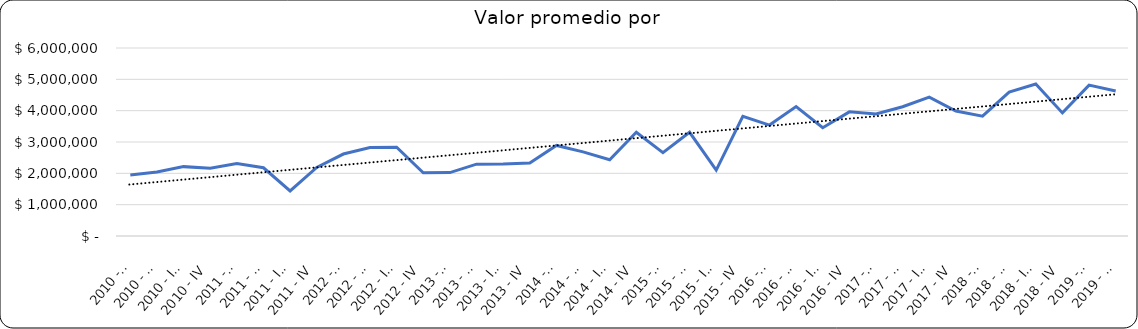
| Category | Valor m2 en Bogotá por sectores |
|---|---|
| 2010 - I | 1945945.946 |
| 2010 - II | 2040540.541 |
| 2010 - III | 2213963.964 |
| 2010 - IV | 2164414.414 |
| 2011 - I | 2311111.111 |
| 2011 - II | 2177777.778 |
| 2011 - III | 1437777.778 |
| 2011 - IV | 2188888.889 |
| 2012 - I | 2615740.741 |
| 2012 - II | 2821759.259 |
| 2012 - III | 2833333.333 |
| 2012 - IV | 2018518.519 |
| 2013 - I | 2023809.524 |
| 2013 - II | 2292857.143 |
| 2013 - III | 2300000 |
| 2013 - IV | 2330952.381 |
| 2014 - I | 2890295.359 |
| 2014 - II | 2686286.92 |
| 2014 - III | 2432489.451 |
| 2014 - IV | 3312236.287 |
| 2015 - I | 2657596.372 |
| 2015 - II | 3310657.596 |
| 2015 - III | 2103401.361 |
| 2015 - IV | 3816326.531 |
| 2016 - I | 3540000 |
| 2016 - II | 4129353.234 |
| 2016 - III | 3454954.955 |
| 2016 - IV | 3961352.657 |
| 2017 - I | 3894977.169 |
| 2017 - II | 4125000 |
| 2017 - III | 4432870.4 |
| 2017 - IV | 3987473.904 |
| 2018 - I | 3823529.412 |
| 2018 - II | 4590163.934 |
| 2018 - III | 4848485 |
| 2018 - IV | 3928571 |
| 2019 - I | 4814815 |
| 2019 - II | 4626866 |